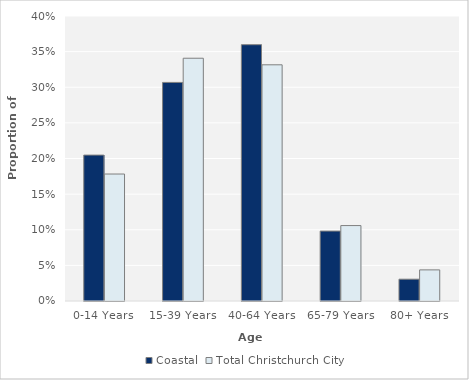
| Category | Coastal | Total Christchurch City |
|---|---|---|
| 0-14 Years | 0.205 | 0.178 |
| 15-39 Years | 0.307 | 0.341 |
| 40-64 Years | 0.36 | 0.331 |
| 65-79 Years | 0.098 | 0.106 |
| 80+ Years | 0.031 | 0.044 |